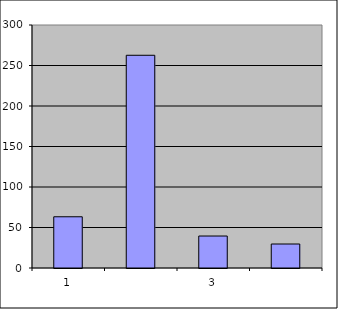
| Category | Series 0 |
|---|---|
| 0 | 63.25 |
| 1 | 262.634 |
| 2 | 39.484 |
| 3 | 29.612 |